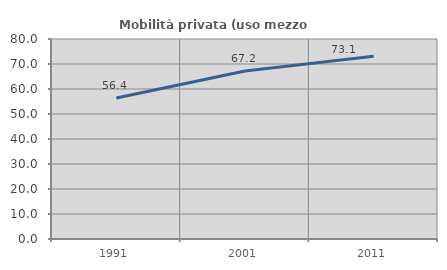
| Category | Mobilità privata (uso mezzo privato) |
|---|---|
| 1991.0 | 56.393 |
| 2001.0 | 67.218 |
| 2011.0 | 73.077 |